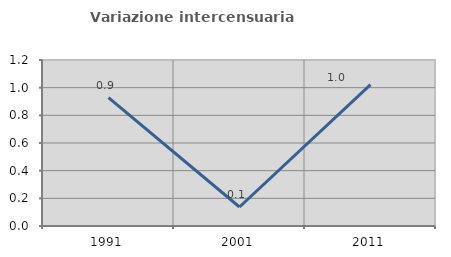
| Category | Variazione intercensuaria annua |
|---|---|
| 1991.0 | 0.929 |
| 2001.0 | 0.137 |
| 2011.0 | 1.022 |